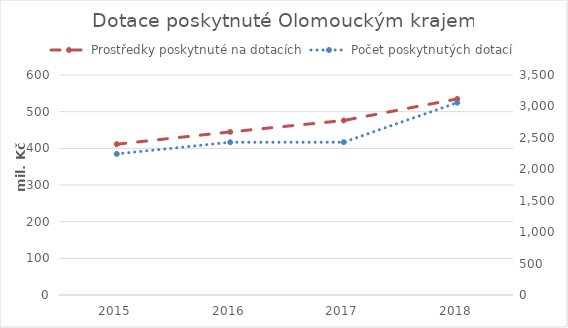
| Category | Prostředky poskytnuté na dotacích |
|---|---|
| 2015.0 | 411249 |
| 2016.0 | 444783 |
| 2017.0 | 475973 |
| 2018.0 | 534714 |